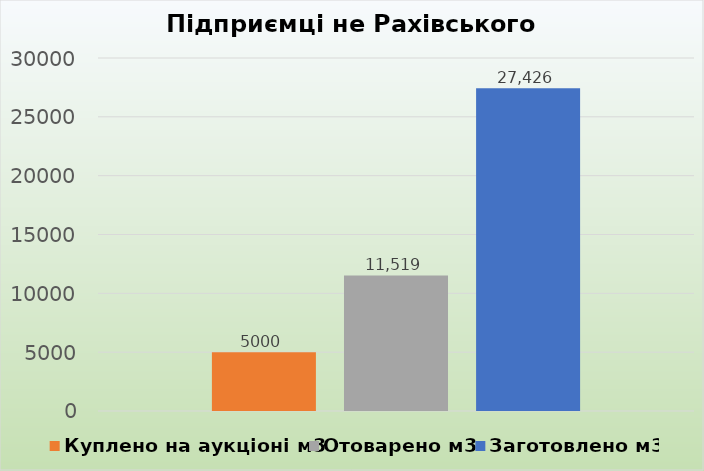
| Category | Куплено на аукціоні м3 | Отоварено м3 | Заготовлено м3 |
|---|---|---|---|
| Разом | 5000 | 11519.041 | 27426.009 |